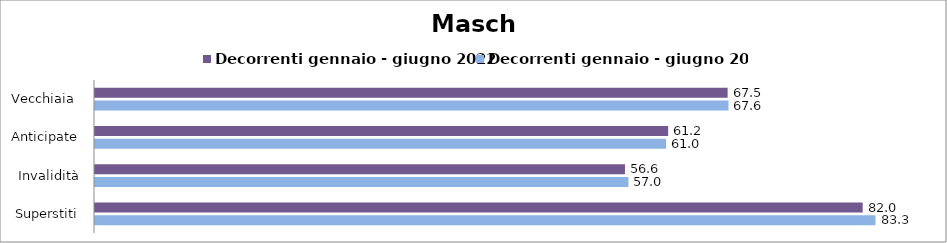
| Category | Decorrenti gennaio - giugno 2022 | Decorrenti gennaio - giugno 2023 |
|---|---|---|
| Vecchiaia  | 67.54 | 67.63 |
| Anticipate | 61.19 | 60.97 |
| Invalidità | 56.58 | 56.95 |
| Superstiti | 81.96 | 83.33 |